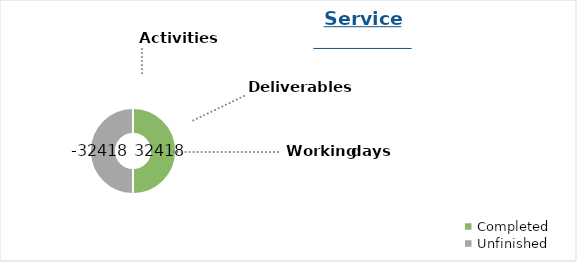
| Category | Progress | Activities | Deliverables |
|---|---|---|---|
| Completed | 32418 | 0 | 0 |
| Unfinished | -32418 | 0 | 0 |